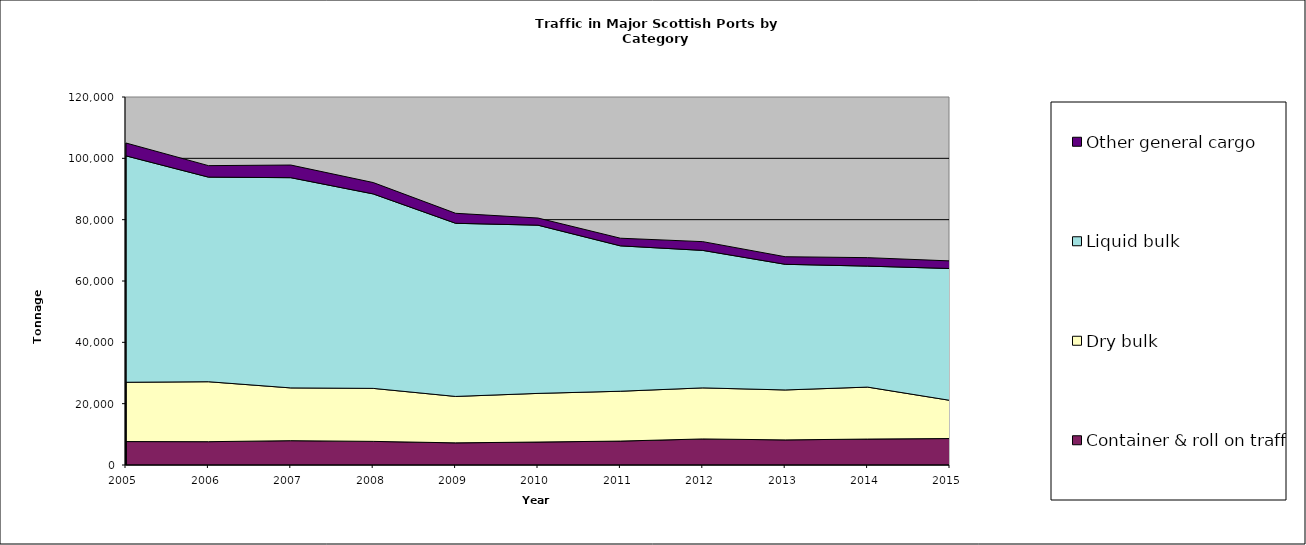
| Category | Container & roll on traffic | Dry bulk | Liquid bulk | Other general cargo |
|---|---|---|---|---|
| 2005.0 | 7639 | 19339 | 73828 | 4190 |
| 2006.0 | 7604 | 19548 | 66724 | 3744 |
| 2007.0 | 7932 | 17207 | 68553 | 4121 |
| 2008.0 | 7700 | 17283 | 63416 | 3709 |
| 2009.0 | 7217 | 15140 | 56462 | 3262 |
| 2010.0 | 7487 | 15862 | 54848 | 2332 |
| 2011.0 | 7799 | 16253 | 47410 | 2489 |
| 2012.0 | 8494 | 16651 | 44829 | 2859 |
| 2013.0 | 8186 | 16283 | 40973 | 2475 |
| 2014.0 | 8456 | 16944 | 39455 | 2761 |
| 2015.0 | 8630.139 | 12446 | 42993 | 2483 |